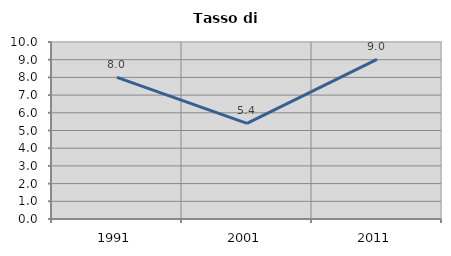
| Category | Tasso di disoccupazione   |
|---|---|
| 1991.0 | 8 |
| 2001.0 | 5.405 |
| 2011.0 | 9.02 |